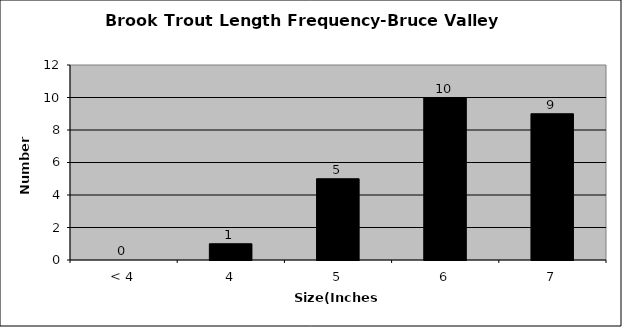
| Category | Series 0 |
|---|---|
| < 4 | 0 |
| 4 | 1 |
| 5 | 5 |
| 6 | 10 |
| 7 | 9 |